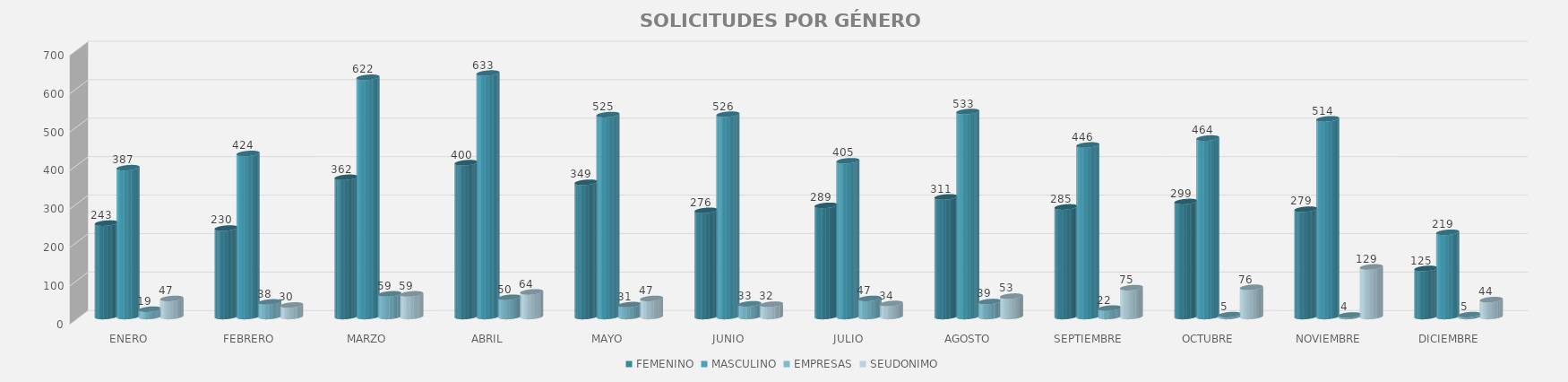
| Category | FEMENINO | MASCULINO | EMPRESAS | SEUDONIMO |
|---|---|---|---|---|
| ENERO | 243 | 387 | 19 | 47 |
| FEBRERO | 230 | 424 | 38 | 30 |
| MARZO  | 362 | 622 | 59 | 59 |
| ABRIL | 400 | 633 | 50 | 64 |
| MAYO | 349 | 525 | 31 | 47 |
| JUNIO | 276 | 526 | 33 | 32 |
| JULIO | 289 | 405 | 47 | 34 |
| AGOSTO | 311 | 533 | 39 | 53 |
| SEPTIEMBRE | 285 | 446 | 22 | 75 |
| OCTUBRE | 299 | 464 | 5 | 76 |
| NOVIEMBRE | 279 | 514 | 4 | 129 |
| DICIEMBRE | 125 | 219 | 5 | 44 |